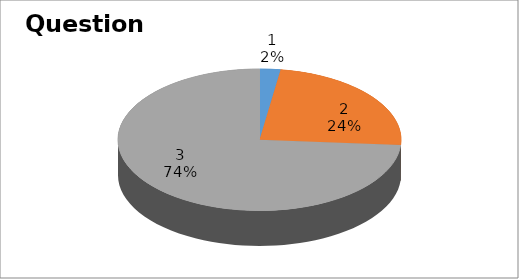
| Category | Series 0 |
|---|---|
| 0 | 1 |
| 1 | 10 |
| 2 | 31 |